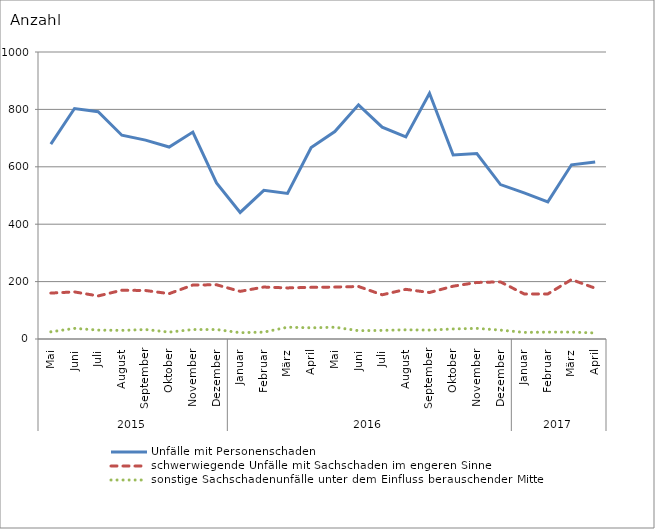
| Category | Unfälle mit Personenschaden | schwerwiegende Unfälle mit Sachschaden im engeren Sinne | sonstige Sachschadenunfälle unter dem Einfluss berauschender Mittel |
|---|---|---|---|
| 0 | 679 | 160 | 25 |
| 1 | 803 | 164 | 37 |
| 2 | 792 | 150 | 31 |
| 3 | 710 | 170 | 30 |
| 4 | 693 | 169 | 33 |
| 5 | 669 | 158 | 24 |
| 6 | 721 | 188 | 33 |
| 7 | 544 | 189 | 33 |
| 8 | 441 | 166 | 22 |
| 9 | 518 | 181 | 24 |
| 10 | 507 | 178 | 41 |
| 11 | 667 | 180 | 39 |
| 12 | 723 | 181 | 41 |
| 13 | 816 | 183 | 29 |
| 14 | 738 | 154 | 30 |
| 15 | 704 | 173 | 32 |
| 16 | 856 | 162 | 31 |
| 17 | 641 | 184 | 35 |
| 18 | 646 | 197 | 37 |
| 19 | 538 | 199 | 31 |
| 20 | 509 | 157 | 23 |
| 21 | 478 | 157 | 24 |
| 22 | 607 | 207 | 24 |
| 23 | 617 | 177 | 21 |